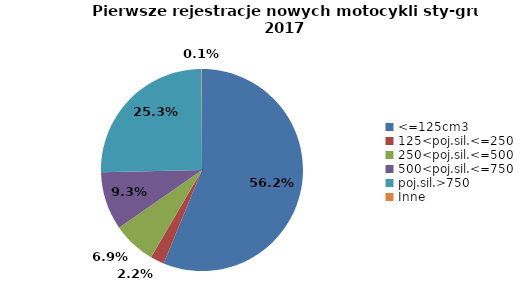
| Category | Series 0 |
|---|---|
| 0 | 8448 |
| 1 | 335 |
| 2 | 1036 |
| 3 | 1399 |
| 4 | 3802 |
| 5 | 12 |